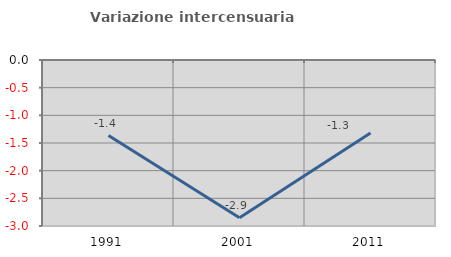
| Category | Variazione intercensuaria annua |
|---|---|
| 1991.0 | -1.365 |
| 2001.0 | -2.851 |
| 2011.0 | -1.318 |